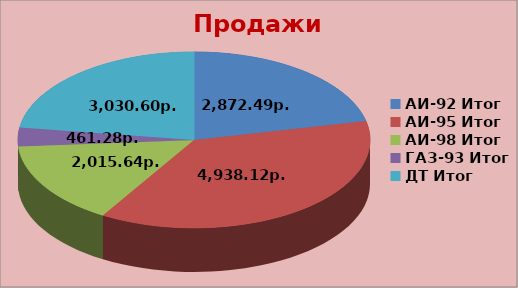
| Category | Series 0 |
|---|---|
| АИ-92 Итог | 2872.49 |
| АИ-95 Итог | 4938.12 |
| АИ-98 Итог | 2015.64 |
| ГАЗ-93 Итог | 461.28 |
| ДТ Итог | 3030.6 |